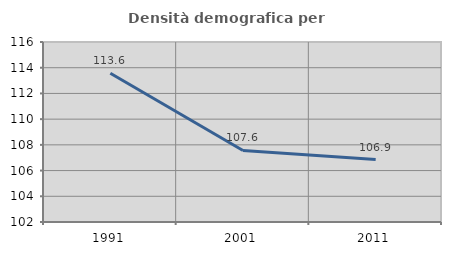
| Category | Densità demografica |
|---|---|
| 1991.0 | 113.575 |
| 2001.0 | 107.562 |
| 2011.0 | 106.854 |